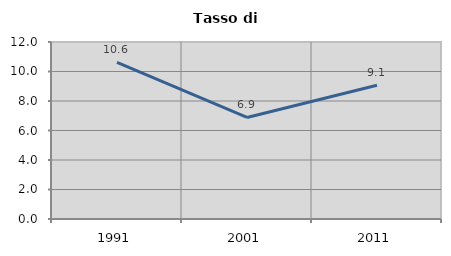
| Category | Tasso di disoccupazione   |
|---|---|
| 1991.0 | 10.624 |
| 2001.0 | 6.882 |
| 2011.0 | 9.073 |